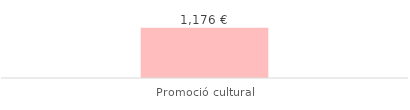
| Category | Total |
|---|---|
| Promoció cultural | 1176.12 |